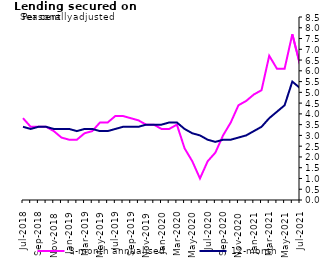
| Category | 3-month annualised | 12-month |
|---|---|---|
| Mar-2018 | 3.1 | 3.4 |
| Apr-2018 | 3.1 | 3.4 |
| May-2018 | 3.5 | 3.4 |
| Jun-2018 | 3.6 | 3.4 |
| Jul-2018 | 3.8 | 3.4 |
| Aug-2018 | 3.4 | 3.3 |
| Sep-2018 | 3.4 | 3.4 |
| Oct-2018 | 3.4 | 3.4 |
| Nov-2018 | 3.2 | 3.3 |
| Dec-2018 | 2.9 | 3.3 |
| Jan-2019 | 2.8 | 3.3 |
| Feb-2019 | 2.7 | 3.2 |
| Mar-2019 | 3.1 | 3.3 |
| Apr-2019 | 3.3 | 3.3 |
| May-2019 | 3.7 | 3.2 |
| Jun-2019 | 3.6 | 3.2 |
| Jul-2019 | 3.9 | 3.3 |
| Aug-2019 | 3.9 | 3.4 |
| Sep-2019 | 3.9 | 3.4 |
| Oct-2019 | 3.7 | 3.4 |
| Nov-2019 | 3.5 | 3.5 |
| Dec-2019 | 3.5 | 3.5 |
| Jan-2020 | 3.3 | 3.5 |
| Feb-2020 | 3.2 | 3.6 |
| Mar-2020 | 3.5 | 3.6 |
| Apr-2020 | 2.4 | 3.3 |
| May-2020 | 1.9 | 3.1 |
| Jun-2020 | 1 | 3 |
| Jul-2020 | 1.8 | 2.8 |
| Aug-2020 | 2.2 | 2.7 |
| Sep-2020 | 3.1 | 2.8 |
| Oct-2020 | 3.6 | 2.8 |
| Nov-2020 | 4.4 | 2.9 |
| Dec-2020 | 4.5 | 3 |
| Jan-2021 | 4.7 | 3.1 |
| Feb-2021 | 4.8 | 3.3 |
| Mar-2021 | 6.5 | 3.8 |